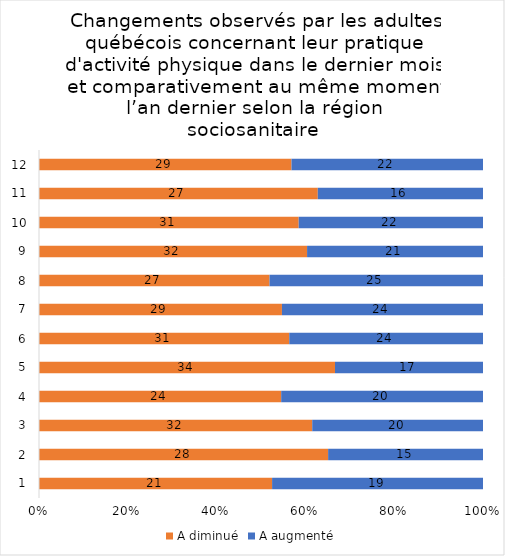
| Category | A diminué | A augmenté |
|---|---|---|
| 0 | 21 | 19 |
| 1 | 28 | 15 |
| 2 | 32 | 20 |
| 3 | 24 | 20 |
| 4 | 34 | 17 |
| 5 | 31 | 24 |
| 6 | 29 | 24 |
| 7 | 27 | 25 |
| 8 | 32 | 21 |
| 9 | 31 | 22 |
| 10 | 27 | 16 |
| 11 | 29 | 22 |